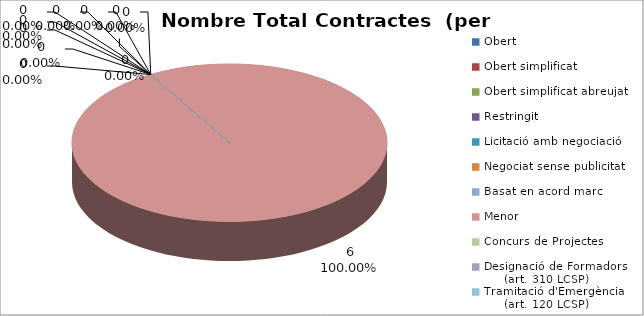
| Category | Nombre Total Contractes |
|---|---|
| Obert | 0 |
| Obert simplificat | 0 |
| Obert simplificat abreujat | 0 |
| Restringit | 0 |
| Licitació amb negociació | 0 |
| Negociat sense publicitat | 0 |
| Basat en acord marc | 0 |
| Menor | 6 |
| Concurs de Projectes | 0 |
| Designació de Formadors
     (art. 310 LCSP) | 0 |
| Tramitació d'Emergència
     (art. 120 LCSP) | 0 |